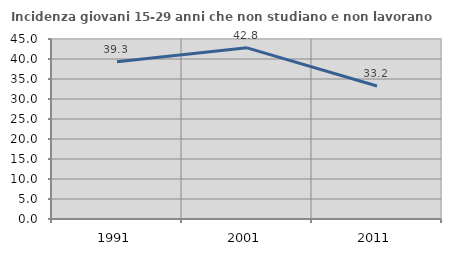
| Category | Incidenza giovani 15-29 anni che non studiano e non lavorano  |
|---|---|
| 1991.0 | 39.292 |
| 2001.0 | 42.791 |
| 2011.0 | 33.247 |